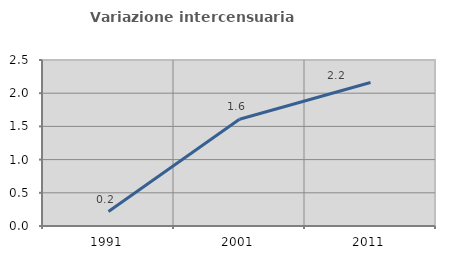
| Category | Variazione intercensuaria annua |
|---|---|
| 1991.0 | 0.218 |
| 2001.0 | 1.607 |
| 2011.0 | 2.16 |